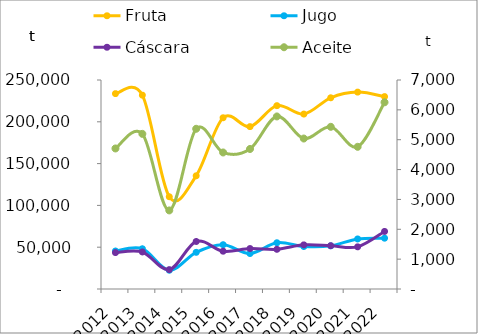
| Category | Fruta | Jugo  | Cáscara |
|---|---|---|---|
| 2012.0 | 233704.088 | 45418 | 43553 |
| 2013.0 | 231865.023 | 48130 | 44312 |
| 2014.0 | 110361.345 | 22425 | 23181 |
| 2015.0 | 135425.682 | 43866.611 | 56838.497 |
| 2016.0 | 204832.515 | 52990.589 | 45207.128 |
| 2017.0 | 194213.972 | 42455.811 | 48401.798 |
| 2018.0 | 219302.993 | 55321.056 | 47497.645 |
| 2019.0 | 209258.73 | 50792.832 | 52786.055 |
| 2020.0 | 228739.289 | 51604.889 | 51823 |
| 2021.0 | 235534.025 | 59883.412 | 50443.779 |
| 2022.0 | 230149.244 | 60799.091 | 68859.038 |